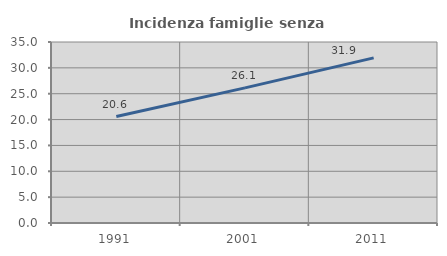
| Category | Incidenza famiglie senza nuclei |
|---|---|
| 1991.0 | 20.586 |
| 2001.0 | 26.127 |
| 2011.0 | 31.933 |